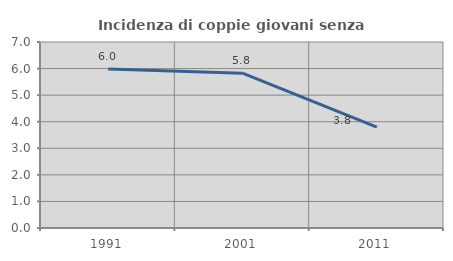
| Category | Incidenza di coppie giovani senza figli |
|---|---|
| 1991.0 | 5.983 |
| 2001.0 | 5.826 |
| 2011.0 | 3.797 |